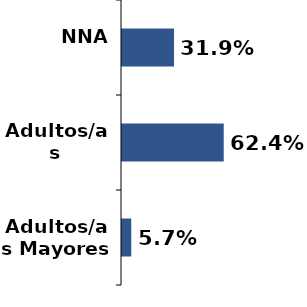
| Category | Series 1 |
|---|---|
| NNA | 0.319 |
| Adultos/as | 0.624 |
| Adultos/as Mayores | 0.057 |